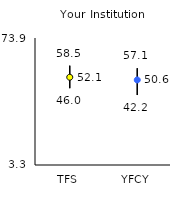
| Category | 25th | 75th | Mean |
|---|---|---|---|
| TFS | 46 | 58.5 | 52.09 |
| YFCY | 42.2 | 57.1 | 50.59 |